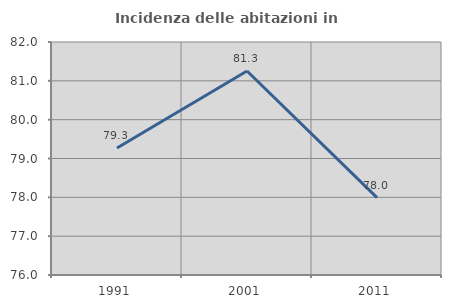
| Category | Incidenza delle abitazioni in proprietà  |
|---|---|
| 1991.0 | 79.269 |
| 2001.0 | 81.253 |
| 2011.0 | 77.994 |